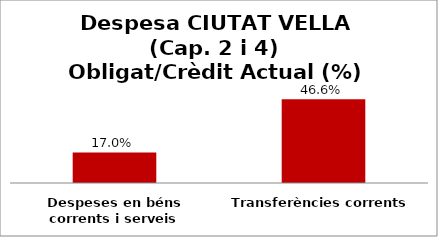
| Category | Series 0 |
|---|---|
| Despeses en béns corrents i serveis | 0.17 |
| Transferències corrents | 0.466 |